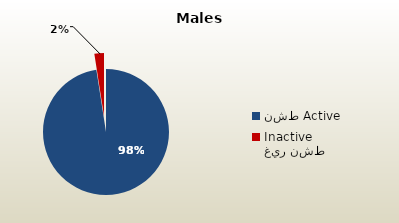
| Category | الذكور غير القطريين  Non-Qatari Males |
|---|---|
| نشط Active | 1765077 |
| غير نشط Inactive | 44388 |